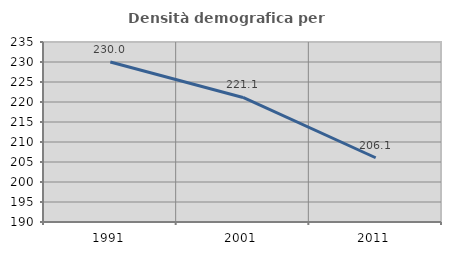
| Category | Densità demografica |
|---|---|
| 1991.0 | 229.985 |
| 2001.0 | 221.13 |
| 2011.0 | 206.062 |